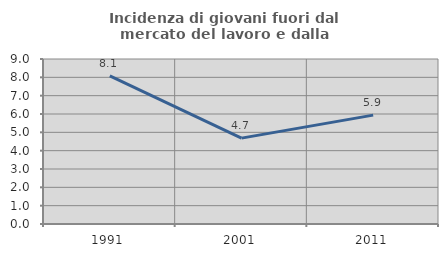
| Category | Incidenza di giovani fuori dal mercato del lavoro e dalla formazione  |
|---|---|
| 1991.0 | 8.084 |
| 2001.0 | 4.683 |
| 2011.0 | 5.94 |